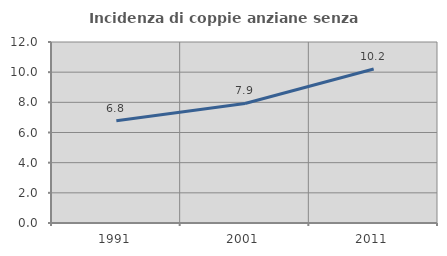
| Category | Incidenza di coppie anziane senza figli  |
|---|---|
| 1991.0 | 6.777 |
| 2001.0 | 7.924 |
| 2011.0 | 10.21 |